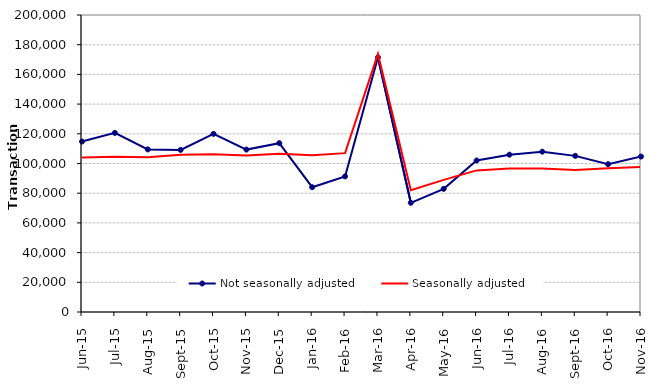
| Category | Not seasonally adjusted | Seasonally adjusted |
|---|---|---|
| 2015-06-01 | 114770 | 104080 |
| 2015-07-01 | 120610 | 104470 |
| 2015-08-01 | 109480 | 104210 |
| 2015-09-01 | 109160 | 105920 |
| 2015-10-01 | 119950 | 106200 |
| 2015-11-01 | 109370 | 105340 |
| 2015-12-01 | 113690 | 106500 |
| 2016-01-01 | 84030 | 105530 |
| 2016-02-01 | 91310 | 106980 |
| 2016-03-01 | 171370 | 173750 |
| 2016-04-01 | 73530 | 81960 |
| 2016-05-01 | 82940 | 88950 |
| 2016-06-01 | 102010 | 95350 |
| 2016-07-01 | 105940 | 96590 |
| 2016-08-01 | 107970 | 96630 |
| 2016-09-01 | 105140 | 95620 |
| 2016-10-01 | 99550 | 96850 |
| 2016-11-01 | 104670 | 97600 |